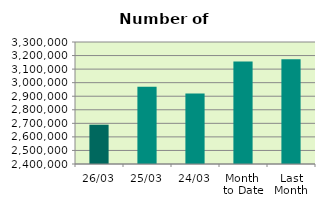
| Category | Series 0 |
|---|---|
| 26/03 | 2689892 |
| 25/03 | 2969394 |
| 24/03 | 2920054 |
| Month 
to Date | 3155390.4 |
| Last
Month | 3172414.4 |